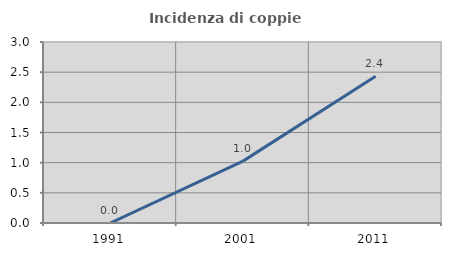
| Category | Incidenza di coppie miste |
|---|---|
| 1991.0 | 0 |
| 2001.0 | 1.026 |
| 2011.0 | 2.434 |